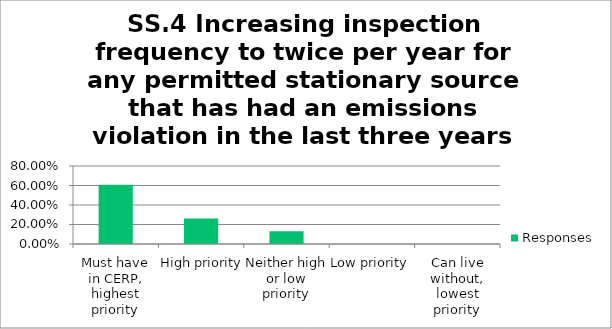
| Category | Responses |
|---|---|
| Must have in CERP, highest priority | 0.609 |
| High priority | 0.261 |
| Neither high or low priority | 0.13 |
| Low priority | 0 |
| Can live without, lowest priority | 0 |